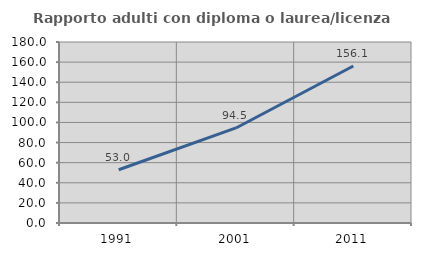
| Category | Rapporto adulti con diploma o laurea/licenza media  |
|---|---|
| 1991.0 | 52.986 |
| 2001.0 | 94.515 |
| 2011.0 | 156.121 |